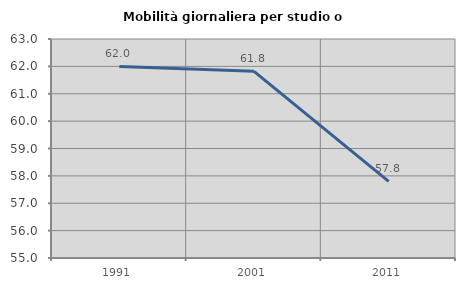
| Category | Mobilità giornaliera per studio o lavoro |
|---|---|
| 1991.0 | 61.998 |
| 2001.0 | 61.821 |
| 2011.0 | 57.802 |